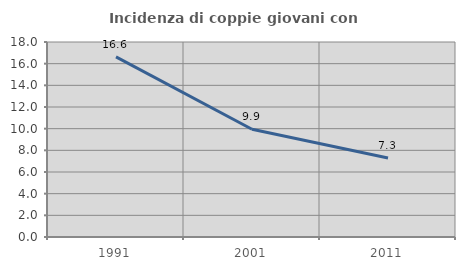
| Category | Incidenza di coppie giovani con figli |
|---|---|
| 1991.0 | 16.631 |
| 2001.0 | 9.949 |
| 2011.0 | 7.295 |